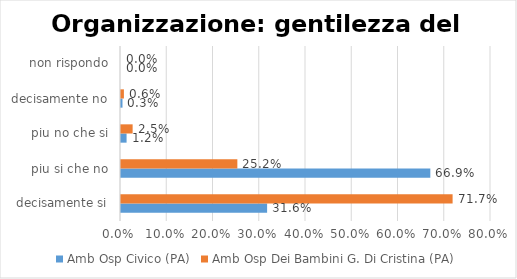
| Category | Amb Osp Civico (PA) | Amb Osp Dei Bambini G. Di Cristina (PA) |
|---|---|---|
| decisamente si | 0.316 | 0.717 |
| piu si che no | 0.669 | 0.252 |
| piu no che si | 0.012 | 0.025 |
| decisamente no | 0.003 | 0.006 |
| non rispondo | 0 | 0 |